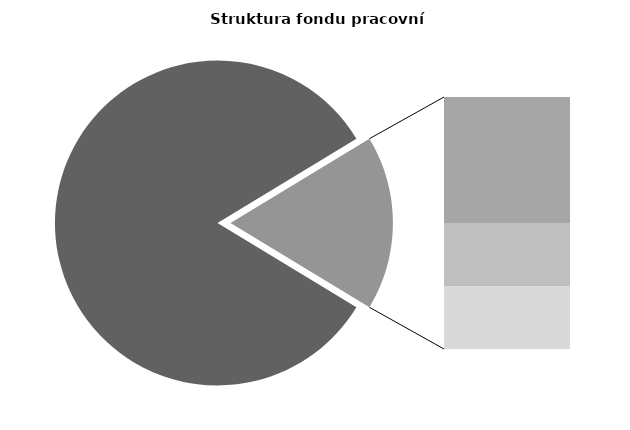
| Category | Series 0 |
|---|---|
| Průměrná měsíční odpracovaná doba bez přesčasu | 139.335 |
| Dovolená | 14.637 |
| Nemoc | 7.377 |
| Jiné | 7.259 |